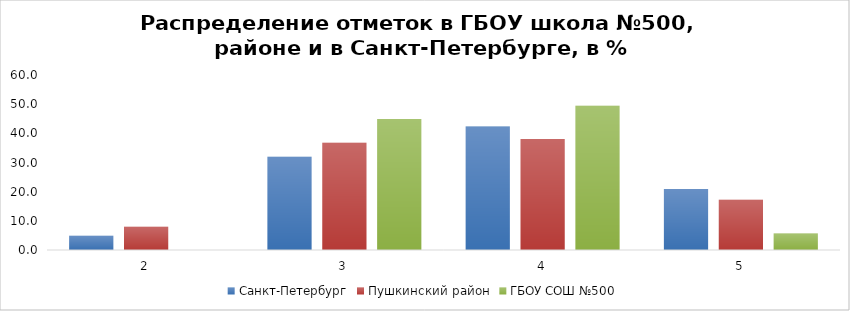
| Category | Санкт-Петербург | Пушкинский район | ГБОУ СОШ №500 |
|---|---|---|---|
| 2.0 | 4.87 | 7.93 | 0 |
| 3.0 | 31.95 | 36.77 | 44.94 |
| 4.0 | 42.31 | 38.04 | 49.44 |
| 5.0 | 20.88 | 17.26 | 5.62 |